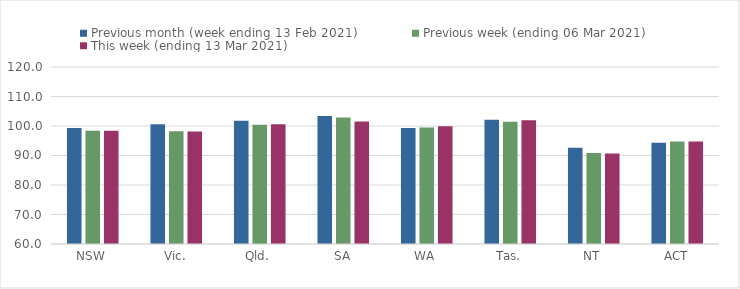
| Category | Previous month (week ending 13 Feb 2021) | Previous week (ending 06 Mar 2021) | This week (ending 13 Mar 2021) |
|---|---|---|---|
| NSW | 99.33 | 98.42 | 98.42 |
| Vic. | 100.6 | 98.22 | 98.17 |
| Qld. | 101.77 | 100.45 | 100.59 |
| SA | 103.38 | 102.86 | 101.49 |
| WA | 99.33 | 99.46 | 99.89 |
| Tas. | 102.13 | 101.46 | 101.91 |
| NT | 92.6 | 90.86 | 90.7 |
| ACT | 94.33 | 94.76 | 94.76 |